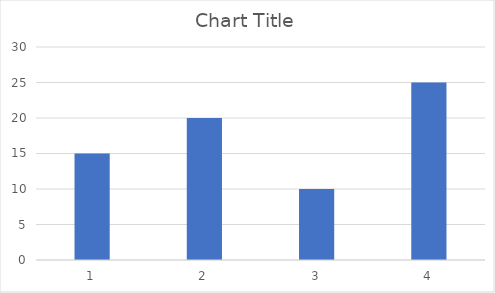
| Category | Series 0 |
|---|---|
| 0 | 15 |
| 1900-01-01 | 20 |
| 1900-01-02 | 10 |
| 1900-01-03 | 25 |